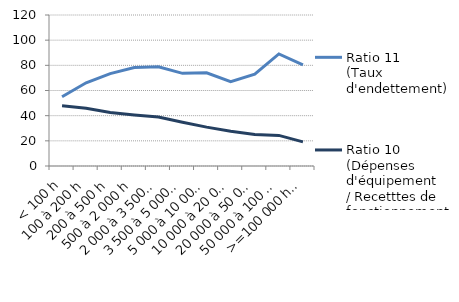
| Category | Ratio 11
(Taux d'endettement) | Ratio 10 
(Dépenses d'équipement
/ Recetttes de fonctionnement) |
|---|---|---|
| < 100 h | 55.091 | 47.862 |
| 100 à 200 h | 66.149 | 45.862 |
| 200 à 500 h | 73.411 | 42.444 |
| 500 à 2 000 h | 78.285 | 40.575 |
| 2 000 à 3 500 h | 78.811 | 38.931 |
| 3 500 à 5 000 h | 73.635 | 34.82 |
| 5 000 à 10 000 h | 74.106 | 30.907 |
| 10 000 à 20 000 h | 67.105 | 27.668 |
| 20 000 à 50 000 h | 72.985 | 25.046 |
| 50 000 à 100 000 h | 89.046 | 24.325 |
| >=100 000 h hors Paris | 80.432 | 19.208 |